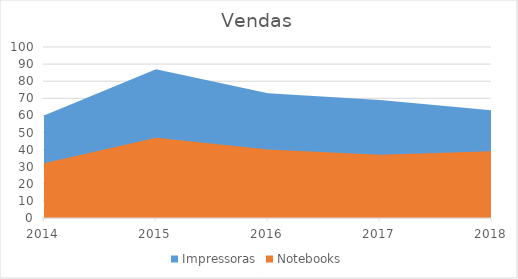
| Category | Impressoras | Notebooks |
|---|---|---|
| 2014.0 | 60 | 32 |
| 2015.0 | 87 | 47 |
| 2016.0 | 73 | 40 |
| 2017.0 | 69 | 37 |
| 2018.0 | 63 | 39 |